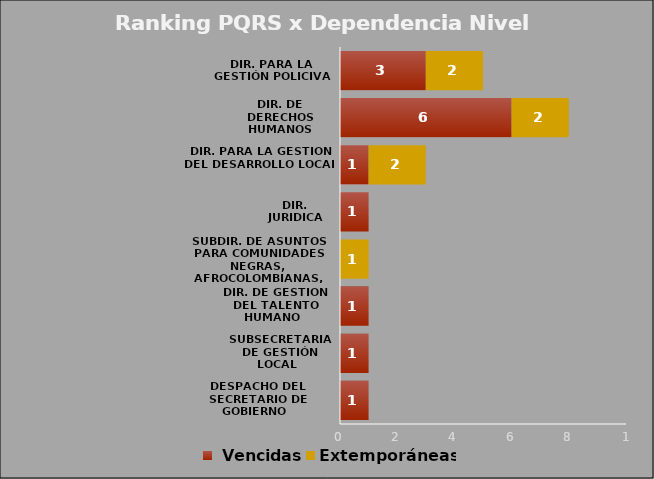
| Category |  Vencidas | Extemporáneas |
|---|---|---|
| DESPACHO DEL SECRETARIO DE GOBIERNO  | 1 | 0 |
| SUBSECRETARIA DE GESTIÓN LOCAL  | 1 | 0 |
| DIR. DE GESTIÓN DEL TALENTO HUMANO  | 1 | 0 |
| SUBDIR. DE ASUNTOS PARA COMUNIDADES NEGRAS, AFROCOLOMBIANAS, RAIZALES Y PALENQUERAS | 0 | 1 |
| DIR. JURIDICA | 1 | 0 |
| DIR. PARA LA GESTION DEL DESARROLLO LOCAL | 1 | 2 |
| DIR. DE DERECHOS HUMANOS | 6 | 2 |
| DIR. PARA LA GESTIÓN POLICIVA | 3 | 2 |